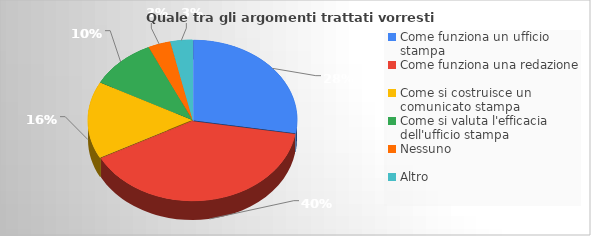
| Category | Series 0 |
|---|---|
| Come funziona un ufficio stampa | 16 |
| Come funziona una redazione | 23 |
| Come si costruisce un comunicato stampa | 9 |
| Come si valuta l'efficacia dell'ufficio stampa | 6 |
| Nessuno | 2 |
| Altro | 2 |